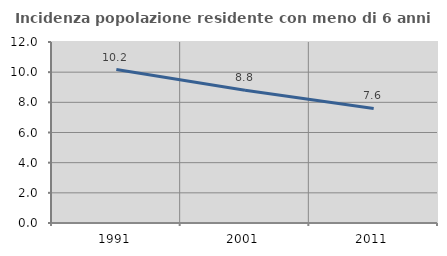
| Category | Incidenza popolazione residente con meno di 6 anni |
|---|---|
| 1991.0 | 10.172 |
| 2001.0 | 8.795 |
| 2011.0 | 7.594 |